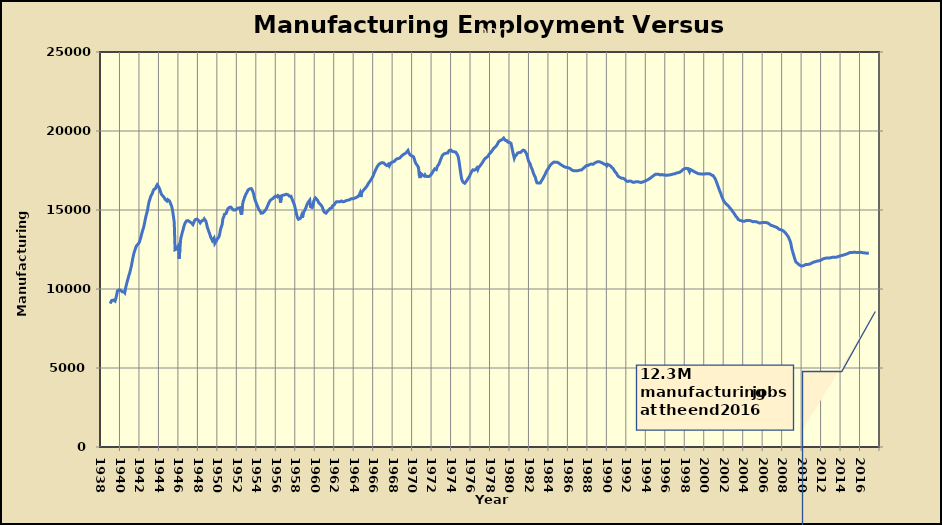
| Category | Value |
|---|---|
| 1939-01-01 | 9077 |
| 1939-02-01 | 9175 |
| 1939-03-01 | 9275 |
| 1939-04-01 | 9309 |
| 1939-05-01 | 9299 |
| 1939-06-01 | 9315 |
| 1939-07-01 | 9231 |
| 1939-08-01 | 9400 |
| 1939-09-01 | 9604 |
| 1939-10-01 | 9873 |
| 1939-11-01 | 9896 |
| 1939-12-01 | 9949 |
| 1940-01-01 | 9927 |
| 1940-02-01 | 9916 |
| 1940-03-01 | 9884 |
| 1940-04-01 | 9817 |
| 1940-05-01 | 9810 |
| 1940-06-01 | 9832 |
| 1940-07-01 | 9766 |
| 1940-08-01 | 10048 |
| 1940-09-01 | 10258 |
| 1940-10-01 | 10471 |
| 1940-11-01 | 10643 |
| 1940-12-01 | 10847 |
| 1941-01-01 | 10993 |
| 1941-02-01 | 11211 |
| 1941-03-01 | 11409 |
| 1941-04-01 | 11698 |
| 1941-05-01 | 11957 |
| 1941-06-01 | 12204 |
| 1941-07-01 | 12382 |
| 1941-08-01 | 12532 |
| 1941-09-01 | 12683 |
| 1941-10-01 | 12770 |
| 1941-11-01 | 12810 |
| 1941-12-01 | 12876 |
| 1942-01-01 | 12965 |
| 1942-02-01 | 13127 |
| 1942-03-01 | 13311 |
| 1942-04-01 | 13509 |
| 1942-05-01 | 13704 |
| 1942-06-01 | 13842 |
| 1942-07-01 | 14072 |
| 1942-08-01 | 14339 |
| 1942-09-01 | 14582 |
| 1942-10-01 | 14772 |
| 1942-11-01 | 14971 |
| 1942-12-01 | 15288 |
| 1943-01-01 | 15532 |
| 1943-02-01 | 15685 |
| 1943-03-01 | 15856 |
| 1943-04-01 | 15961 |
| 1943-05-01 | 16044 |
| 1943-06-01 | 16204 |
| 1943-07-01 | 16306 |
| 1943-08-01 | 16369 |
| 1943-09-01 | 16366 |
| 1943-10-01 | 16512 |
| 1943-11-01 | 16598 |
| 1943-12-01 | 16526 |
| 1944-01-01 | 16439 |
| 1944-02-01 | 16330 |
| 1944-03-01 | 16170 |
| 1944-04-01 | 16012 |
| 1944-05-01 | 15944 |
| 1944-06-01 | 15890 |
| 1944-07-01 | 15832 |
| 1944-08-01 | 15781 |
| 1944-09-01 | 15662 |
| 1944-10-01 | 15630 |
| 1944-11-01 | 15568 |
| 1944-12-01 | 15659 |
| 1945-01-01 | 15669 |
| 1945-02-01 | 15581 |
| 1945-03-01 | 15473 |
| 1945-04-01 | 15335 |
| 1945-05-01 | 15201 |
| 1945-06-01 | 14948 |
| 1945-07-01 | 14599 |
| 1945-08-01 | 14201 |
| 1945-09-01 | 12486 |
| 1945-10-01 | 12487 |
| 1945-11-01 | 12537 |
| 1945-12-01 | 12528 |
| 1946-01-01 | 12719 |
| 1946-02-01 | 11922 |
| 1946-03-01 | 12545 |
| 1946-04-01 | 13200 |
| 1946-05-01 | 13389 |
| 1946-06-01 | 13598 |
| 1946-07-01 | 13771 |
| 1946-08-01 | 13981 |
| 1946-09-01 | 14135 |
| 1946-10-01 | 14182 |
| 1946-11-01 | 14310 |
| 1946-12-01 | 14301 |
| 1947-01-01 | 14328 |
| 1947-02-01 | 14278 |
| 1947-03-01 | 14259 |
| 1947-04-01 | 14240 |
| 1947-05-01 | 14189 |
| 1947-06-01 | 14200 |
| 1947-07-01 | 14076 |
| 1947-08-01 | 14200 |
| 1947-09-01 | 14315 |
| 1947-10-01 | 14393 |
| 1947-11-01 | 14414 |
| 1947-12-01 | 14428 |
| 1948-01-01 | 14438 |
| 1948-02-01 | 14339 |
| 1948-03-01 | 14364 |
| 1948-04-01 | 14183 |
| 1948-05-01 | 14235 |
| 1948-06-01 | 14318 |
| 1948-07-01 | 14359 |
| 1948-08-01 | 14353 |
| 1948-09-01 | 14441 |
| 1948-10-01 | 14390 |
| 1948-11-01 | 14292 |
| 1948-12-01 | 14086 |
| 1949-01-01 | 13867 |
| 1949-02-01 | 13734 |
| 1949-03-01 | 13581 |
| 1949-04-01 | 13439 |
| 1949-05-01 | 13269 |
| 1949-06-01 | 13178 |
| 1949-07-01 | 13067 |
| 1949-08-01 | 13158 |
| 1949-09-01 | 13225 |
| 1949-10-01 | 12891 |
| 1949-11-01 | 12882 |
| 1949-12-01 | 13062 |
| 1950-01-01 | 13161 |
| 1950-02-01 | 13169 |
| 1950-03-01 | 13290 |
| 1950-04-01 | 13471 |
| 1950-05-01 | 13780 |
| 1950-06-01 | 13923 |
| 1950-07-01 | 14072 |
| 1950-08-01 | 14461 |
| 1950-09-01 | 14561 |
| 1950-10-01 | 14737 |
| 1950-11-01 | 14762 |
| 1950-12-01 | 14782 |
| 1951-01-01 | 14950 |
| 1951-02-01 | 15076 |
| 1951-03-01 | 15125 |
| 1951-04-01 | 15166 |
| 1951-05-01 | 15164 |
| 1951-06-01 | 15176 |
| 1951-07-01 | 15110 |
| 1951-08-01 | 15061 |
| 1951-09-01 | 14996 |
| 1951-10-01 | 14973 |
| 1951-11-01 | 14999 |
| 1951-12-01 | 15045 |
| 1952-01-01 | 15067 |
| 1952-02-01 | 15105 |
| 1952-03-01 | 15127 |
| 1952-04-01 | 15162 |
| 1952-05-01 | 15143 |
| 1952-06-01 | 14828 |
| 1952-07-01 | 14707 |
| 1952-08-01 | 15279 |
| 1952-09-01 | 15553 |
| 1952-10-01 | 15690 |
| 1952-11-01 | 15843 |
| 1952-12-01 | 15973 |
| 1953-01-01 | 16067 |
| 1953-02-01 | 16158 |
| 1953-03-01 | 16270 |
| 1953-04-01 | 16293 |
| 1953-05-01 | 16341 |
| 1953-06-01 | 16343 |
| 1953-07-01 | 16353 |
| 1953-08-01 | 16278 |
| 1953-09-01 | 16151 |
| 1953-10-01 | 15981 |
| 1953-11-01 | 15728 |
| 1953-12-01 | 15581 |
| 1954-01-01 | 15440 |
| 1954-02-01 | 15307 |
| 1954-03-01 | 15197 |
| 1954-04-01 | 15065 |
| 1954-05-01 | 14974 |
| 1954-06-01 | 14910 |
| 1954-07-01 | 14799 |
| 1954-08-01 | 14772 |
| 1954-09-01 | 14805 |
| 1954-10-01 | 14841 |
| 1954-11-01 | 14913 |
| 1954-12-01 | 14967 |
| 1955-01-01 | 15034 |
| 1955-02-01 | 15138 |
| 1955-03-01 | 15258 |
| 1955-04-01 | 15375 |
| 1955-05-01 | 15493 |
| 1955-06-01 | 15585 |
| 1955-07-01 | 15614 |
| 1955-08-01 | 15679 |
| 1955-09-01 | 15668 |
| 1955-10-01 | 15740 |
| 1955-11-01 | 15813 |
| 1955-12-01 | 15859 |
| 1956-01-01 | 15882 |
| 1956-02-01 | 15889 |
| 1956-03-01 | 15829 |
| 1956-04-01 | 15909 |
| 1956-05-01 | 15893 |
| 1956-06-01 | 15835 |
| 1956-07-01 | 15468 |
| 1956-08-01 | 15893 |
| 1956-09-01 | 15863 |
| 1956-10-01 | 15937 |
| 1956-11-01 | 15916 |
| 1956-12-01 | 15957 |
| 1957-01-01 | 15970 |
| 1957-02-01 | 15998 |
| 1957-03-01 | 15994 |
| 1957-04-01 | 15970 |
| 1957-05-01 | 15931 |
| 1957-06-01 | 15873 |
| 1957-07-01 | 15854 |
| 1957-08-01 | 15867 |
| 1957-09-01 | 15710 |
| 1957-10-01 | 15599 |
| 1957-11-01 | 15466 |
| 1957-12-01 | 15332 |
| 1958-01-01 | 15130 |
| 1958-02-01 | 14908 |
| 1958-03-01 | 14670 |
| 1958-04-01 | 14506 |
| 1958-05-01 | 14414 |
| 1958-06-01 | 14408 |
| 1958-07-01 | 14450 |
| 1958-08-01 | 14524 |
| 1958-09-01 | 14658 |
| 1958-10-01 | 14503 |
| 1958-11-01 | 14827 |
| 1958-12-01 | 14877 |
| 1959-01-01 | 14998 |
| 1959-02-01 | 15115 |
| 1959-03-01 | 15259 |
| 1959-04-01 | 15385 |
| 1959-05-01 | 15487 |
| 1959-06-01 | 15554 |
| 1959-07-01 | 15623 |
| 1959-08-01 | 15202 |
| 1959-09-01 | 15254 |
| 1959-10-01 | 15158 |
| 1959-11-01 | 15300 |
| 1959-12-01 | 15573 |
| 1960-01-01 | 15687 |
| 1960-02-01 | 15765 |
| 1960-03-01 | 15707 |
| 1960-04-01 | 15654 |
| 1960-05-01 | 15575 |
| 1960-06-01 | 15466 |
| 1960-07-01 | 15413 |
| 1960-08-01 | 15360 |
| 1960-09-01 | 15330 |
| 1960-10-01 | 15231 |
| 1960-11-01 | 15112 |
| 1960-12-01 | 14947 |
| 1961-01-01 | 14863 |
| 1961-02-01 | 14801 |
| 1961-03-01 | 14802 |
| 1961-04-01 | 14825 |
| 1961-05-01 | 14932 |
| 1961-06-01 | 14981 |
| 1961-07-01 | 15029 |
| 1961-08-01 | 15093 |
| 1961-09-01 | 15080 |
| 1961-10-01 | 15143 |
| 1961-11-01 | 15259 |
| 1961-12-01 | 15309 |
| 1962-01-01 | 15322 |
| 1962-02-01 | 15411 |
| 1962-03-01 | 15451 |
| 1962-04-01 | 15524 |
| 1962-05-01 | 15513 |
| 1962-06-01 | 15518 |
| 1962-07-01 | 15522 |
| 1962-08-01 | 15517 |
| 1962-09-01 | 15568 |
| 1962-10-01 | 15569 |
| 1962-11-01 | 15530 |
| 1962-12-01 | 15520 |
| 1963-01-01 | 15545 |
| 1963-02-01 | 15542 |
| 1963-03-01 | 15564 |
| 1963-04-01 | 15602 |
| 1963-05-01 | 15641 |
| 1963-06-01 | 15624 |
| 1963-07-01 | 15646 |
| 1963-08-01 | 15644 |
| 1963-09-01 | 15674 |
| 1963-10-01 | 15714 |
| 1963-11-01 | 15675 |
| 1963-12-01 | 15712 |
| 1964-01-01 | 15715 |
| 1964-02-01 | 15742 |
| 1964-03-01 | 15770 |
| 1964-04-01 | 15785 |
| 1964-05-01 | 15812 |
| 1964-06-01 | 15839 |
| 1964-07-01 | 15887 |
| 1964-08-01 | 15948 |
| 1964-09-01 | 16073 |
| 1964-10-01 | 15821 |
| 1964-11-01 | 16096 |
| 1964-12-01 | 16176 |
| 1965-01-01 | 16245 |
| 1965-02-01 | 16291 |
| 1965-03-01 | 16353 |
| 1965-04-01 | 16418 |
| 1965-05-01 | 16477 |
| 1965-06-01 | 16554 |
| 1965-07-01 | 16669 |
| 1965-08-01 | 16732 |
| 1965-09-01 | 16802 |
| 1965-10-01 | 16864 |
| 1965-11-01 | 16962 |
| 1965-12-01 | 17051 |
| 1966-01-01 | 17143 |
| 1966-02-01 | 17288 |
| 1966-03-01 | 17400 |
| 1966-04-01 | 17517 |
| 1966-05-01 | 17625 |
| 1966-06-01 | 17733 |
| 1966-07-01 | 17760 |
| 1966-08-01 | 17882 |
| 1966-09-01 | 17886 |
| 1966-10-01 | 17956 |
| 1966-11-01 | 17981 |
| 1966-12-01 | 17998 |
| 1967-01-01 | 18033 |
| 1967-02-01 | 17978 |
| 1967-03-01 | 17940 |
| 1967-04-01 | 17878 |
| 1967-05-01 | 17832 |
| 1967-06-01 | 17812 |
| 1967-07-01 | 17784 |
| 1967-08-01 | 17905 |
| 1967-09-01 | 17794 |
| 1967-10-01 | 17800 |
| 1967-11-01 | 17985 |
| 1967-12-01 | 18025 |
| 1968-01-01 | 18040 |
| 1968-02-01 | 18054 |
| 1968-03-01 | 18067 |
| 1968-04-01 | 18131 |
| 1968-05-01 | 18190 |
| 1968-06-01 | 18228 |
| 1968-07-01 | 18265 |
| 1968-08-01 | 18254 |
| 1968-09-01 | 18252 |
| 1968-10-01 | 18293 |
| 1968-11-01 | 18346 |
| 1968-12-01 | 18410 |
| 1969-01-01 | 18432 |
| 1969-02-01 | 18502 |
| 1969-03-01 | 18558 |
| 1969-04-01 | 18554 |
| 1969-05-01 | 18588 |
| 1969-06-01 | 18640 |
| 1969-07-01 | 18642 |
| 1969-08-01 | 18767 |
| 1969-09-01 | 18620 |
| 1969-10-01 | 18613 |
| 1969-11-01 | 18467 |
| 1969-12-01 | 18485 |
| 1970-01-01 | 18424 |
| 1970-02-01 | 18361 |
| 1970-03-01 | 18360 |
| 1970-04-01 | 18207 |
| 1970-05-01 | 18029 |
| 1970-06-01 | 17930 |
| 1970-07-01 | 17877 |
| 1970-08-01 | 17779 |
| 1970-09-01 | 17692 |
| 1970-10-01 | 17173 |
| 1970-11-01 | 17024 |
| 1970-12-01 | 17309 |
| 1971-01-01 | 17280 |
| 1971-02-01 | 17216 |
| 1971-03-01 | 17154 |
| 1971-04-01 | 17149 |
| 1971-05-01 | 17225 |
| 1971-06-01 | 17139 |
| 1971-07-01 | 17126 |
| 1971-08-01 | 17115 |
| 1971-09-01 | 17154 |
| 1971-10-01 | 17126 |
| 1971-11-01 | 17166 |
| 1971-12-01 | 17202 |
| 1972-01-01 | 17283 |
| 1972-02-01 | 17361 |
| 1972-03-01 | 17447 |
| 1972-04-01 | 17508 |
| 1972-05-01 | 17602 |
| 1972-06-01 | 17641 |
| 1972-07-01 | 17556 |
| 1972-08-01 | 17741 |
| 1972-09-01 | 17774 |
| 1972-10-01 | 17893 |
| 1972-11-01 | 18005 |
| 1972-12-01 | 18158 |
| 1973-01-01 | 18276 |
| 1973-02-01 | 18410 |
| 1973-03-01 | 18493 |
| 1973-04-01 | 18530 |
| 1973-05-01 | 18564 |
| 1973-06-01 | 18606 |
| 1973-07-01 | 18598 |
| 1973-08-01 | 18629 |
| 1973-09-01 | 18609 |
| 1973-10-01 | 18702 |
| 1973-11-01 | 18773 |
| 1973-12-01 | 18820 |
| 1974-01-01 | 18788 |
| 1974-02-01 | 18727 |
| 1974-03-01 | 18700 |
| 1974-04-01 | 18702 |
| 1974-05-01 | 18688 |
| 1974-06-01 | 18690 |
| 1974-07-01 | 18656 |
| 1974-08-01 | 18570 |
| 1974-09-01 | 18492 |
| 1974-10-01 | 18364 |
| 1974-11-01 | 18077 |
| 1974-12-01 | 17693 |
| 1975-01-01 | 17344 |
| 1975-02-01 | 17004 |
| 1975-03-01 | 16853 |
| 1975-04-01 | 16759 |
| 1975-05-01 | 16746 |
| 1975-06-01 | 16690 |
| 1975-07-01 | 16678 |
| 1975-08-01 | 16824 |
| 1975-09-01 | 16904 |
| 1975-10-01 | 16984 |
| 1975-11-01 | 17025 |
| 1975-12-01 | 17140 |
| 1976-01-01 | 17287 |
| 1976-02-01 | 17384 |
| 1976-03-01 | 17470 |
| 1976-04-01 | 17541 |
| 1976-05-01 | 17513 |
| 1976-06-01 | 17521 |
| 1976-07-01 | 17524 |
| 1976-08-01 | 17596 |
| 1976-09-01 | 17665 |
| 1976-10-01 | 17548 |
| 1976-11-01 | 17682 |
| 1976-12-01 | 17719 |
| 1977-01-01 | 17803 |
| 1977-02-01 | 17843 |
| 1977-03-01 | 17941 |
| 1977-04-01 | 18024 |
| 1977-05-01 | 18107 |
| 1977-06-01 | 18192 |
| 1977-07-01 | 18259 |
| 1977-08-01 | 18276 |
| 1977-09-01 | 18334 |
| 1977-10-01 | 18356 |
| 1977-11-01 | 18419 |
| 1977-12-01 | 18531 |
| 1978-01-01 | 18593 |
| 1978-02-01 | 18639 |
| 1978-03-01 | 18699 |
| 1978-04-01 | 18772 |
| 1978-05-01 | 18848 |
| 1978-06-01 | 18919 |
| 1978-07-01 | 18951 |
| 1978-08-01 | 19006 |
| 1978-09-01 | 19068 |
| 1978-10-01 | 19142 |
| 1978-11-01 | 19257 |
| 1978-12-01 | 19334 |
| 1979-01-01 | 19388 |
| 1979-02-01 | 19409 |
| 1979-03-01 | 19453 |
| 1979-04-01 | 19450 |
| 1979-05-01 | 19509 |
| 1979-06-01 | 19553 |
| 1979-07-01 | 19531 |
| 1979-08-01 | 19406 |
| 1979-09-01 | 19442 |
| 1979-10-01 | 19390 |
| 1979-11-01 | 19299 |
| 1979-12-01 | 19301 |
| 1980-01-01 | 19282 |
| 1980-02-01 | 19219 |
| 1980-03-01 | 19217 |
| 1980-04-01 | 18973 |
| 1980-05-01 | 18726 |
| 1980-06-01 | 18490 |
| 1980-07-01 | 18276 |
| 1980-08-01 | 18414 |
| 1980-09-01 | 18445 |
| 1980-10-01 | 18506 |
| 1980-11-01 | 18601 |
| 1980-12-01 | 18640 |
| 1981-01-01 | 18639 |
| 1981-02-01 | 18613 |
| 1981-03-01 | 18647 |
| 1981-04-01 | 18711 |
| 1981-05-01 | 18766 |
| 1981-06-01 | 18789 |
| 1981-07-01 | 18785 |
| 1981-08-01 | 18748 |
| 1981-09-01 | 18712 |
| 1981-10-01 | 18566 |
| 1981-11-01 | 18409 |
| 1981-12-01 | 18223 |
| 1982-01-01 | 18047 |
| 1982-02-01 | 17981 |
| 1982-03-01 | 17857 |
| 1982-04-01 | 17683 |
| 1982-05-01 | 17588 |
| 1982-06-01 | 17430 |
| 1982-07-01 | 17278 |
| 1982-08-01 | 17160 |
| 1982-09-01 | 17074 |
| 1982-10-01 | 16853 |
| 1982-11-01 | 16722 |
| 1982-12-01 | 16690 |
| 1983-01-01 | 16705 |
| 1983-02-01 | 16706 |
| 1983-03-01 | 16711 |
| 1983-04-01 | 16794 |
| 1983-05-01 | 16885 |
| 1983-06-01 | 16960 |
| 1983-07-01 | 17059 |
| 1983-08-01 | 17118 |
| 1983-09-01 | 17255 |
| 1983-10-01 | 17367 |
| 1983-11-01 | 17479 |
| 1983-12-01 | 17551 |
| 1984-01-01 | 17630 |
| 1984-02-01 | 17728 |
| 1984-03-01 | 17806 |
| 1984-04-01 | 17872 |
| 1984-05-01 | 17916 |
| 1984-06-01 | 17967 |
| 1984-07-01 | 18013 |
| 1984-08-01 | 18034 |
| 1984-09-01 | 18019 |
| 1984-10-01 | 18024 |
| 1984-11-01 | 18016 |
| 1984-12-01 | 18023 |
| 1985-01-01 | 18009 |
| 1985-02-01 | 17966 |
| 1985-03-01 | 17939 |
| 1985-04-01 | 17886 |
| 1985-05-01 | 17855 |
| 1985-06-01 | 17819 |
| 1985-07-01 | 17776 |
| 1985-08-01 | 17756 |
| 1985-09-01 | 17718 |
| 1985-10-01 | 17708 |
| 1985-11-01 | 17697 |
| 1985-12-01 | 17693 |
| 1986-01-01 | 17686 |
| 1986-02-01 | 17663 |
| 1986-03-01 | 17624 |
| 1986-04-01 | 17616 |
| 1986-05-01 | 17593 |
| 1986-06-01 | 17530 |
| 1986-07-01 | 17497 |
| 1986-08-01 | 17489 |
| 1986-09-01 | 17498 |
| 1986-10-01 | 17477 |
| 1986-11-01 | 17472 |
| 1986-12-01 | 17478 |
| 1987-01-01 | 17465 |
| 1987-02-01 | 17499 |
| 1987-03-01 | 17507 |
| 1987-04-01 | 17525 |
| 1987-05-01 | 17542 |
| 1987-06-01 | 17537 |
| 1987-07-01 | 17593 |
| 1987-08-01 | 17630 |
| 1987-09-01 | 17691 |
| 1987-10-01 | 17729 |
| 1987-11-01 | 17775 |
| 1987-12-01 | 17809 |
| 1988-01-01 | 17790 |
| 1988-02-01 | 17823 |
| 1988-03-01 | 17844 |
| 1988-04-01 | 17874 |
| 1988-05-01 | 17892 |
| 1988-06-01 | 17916 |
| 1988-07-01 | 17926 |
| 1988-08-01 | 17891 |
| 1988-09-01 | 17914 |
| 1988-10-01 | 17966 |
| 1988-11-01 | 18003 |
| 1988-12-01 | 18025 |
| 1989-01-01 | 18057 |
| 1989-02-01 | 18055 |
| 1989-03-01 | 18060 |
| 1989-04-01 | 18055 |
| 1989-05-01 | 18040 |
| 1989-06-01 | 18013 |
| 1989-07-01 | 17980 |
| 1989-08-01 | 17964 |
| 1989-09-01 | 17922 |
| 1989-10-01 | 17895 |
| 1989-11-01 | 17886 |
| 1989-12-01 | 17881 |
| 1990-01-01 | 17797 |
| 1990-02-01 | 17893 |
| 1990-03-01 | 17868 |
| 1990-04-01 | 17845 |
| 1990-05-01 | 17797 |
| 1990-06-01 | 17776 |
| 1990-07-01 | 17704 |
| 1990-08-01 | 17649 |
| 1990-09-01 | 17609 |
| 1990-10-01 | 17577 |
| 1990-11-01 | 17428 |
| 1990-12-01 | 17395 |
| 1991-01-01 | 17330 |
| 1991-02-01 | 17211 |
| 1991-03-01 | 17140 |
| 1991-04-01 | 17093 |
| 1991-05-01 | 17070 |
| 1991-06-01 | 17044 |
| 1991-07-01 | 17015 |
| 1991-08-01 | 17025 |
| 1991-09-01 | 17010 |
| 1991-10-01 | 16999 |
| 1991-11-01 | 16961 |
| 1991-12-01 | 16916 |
| 1992-01-01 | 16839 |
| 1992-02-01 | 16829 |
| 1992-03-01 | 16805 |
| 1992-04-01 | 16831 |
| 1992-05-01 | 16835 |
| 1992-06-01 | 16826 |
| 1992-07-01 | 16819 |
| 1992-08-01 | 16783 |
| 1992-09-01 | 16761 |
| 1992-10-01 | 16751 |
| 1992-11-01 | 16758 |
| 1992-12-01 | 16769 |
| 1993-01-01 | 16791 |
| 1993-02-01 | 16805 |
| 1993-03-01 | 16795 |
| 1993-04-01 | 16772 |
| 1993-05-01 | 16766 |
| 1993-06-01 | 16742 |
| 1993-07-01 | 16739 |
| 1993-08-01 | 16741 |
| 1993-09-01 | 16769 |
| 1993-10-01 | 16778 |
| 1993-11-01 | 16800 |
| 1993-12-01 | 16815 |
| 1994-01-01 | 16855 |
| 1994-02-01 | 16862 |
| 1994-03-01 | 16897 |
| 1994-04-01 | 16933 |
| 1994-05-01 | 16962 |
| 1994-06-01 | 17010 |
| 1994-07-01 | 17026 |
| 1994-08-01 | 17081 |
| 1994-09-01 | 17115 |
| 1994-10-01 | 17144 |
| 1994-11-01 | 17186 |
| 1994-12-01 | 17217 |
| 1995-01-01 | 17262 |
| 1995-02-01 | 17265 |
| 1995-03-01 | 17263 |
| 1995-04-01 | 17278 |
| 1995-05-01 | 17259 |
| 1995-06-01 | 17247 |
| 1995-07-01 | 17218 |
| 1995-08-01 | 17240 |
| 1995-09-01 | 17247 |
| 1995-10-01 | 17216 |
| 1995-11-01 | 17209 |
| 1995-12-01 | 17231 |
| 1996-01-01 | 17208 |
| 1996-02-01 | 17229 |
| 1996-03-01 | 17193 |
| 1996-04-01 | 17204 |
| 1996-05-01 | 17222 |
| 1996-06-01 | 17226 |
| 1996-07-01 | 17223 |
| 1996-08-01 | 17255 |
| 1996-09-01 | 17252 |
| 1996-10-01 | 17268 |
| 1996-11-01 | 17277 |
| 1996-12-01 | 17284 |
| 1997-01-01 | 17297 |
| 1997-02-01 | 17316 |
| 1997-03-01 | 17340 |
| 1997-04-01 | 17349 |
| 1997-05-01 | 17362 |
| 1997-06-01 | 17387 |
| 1997-07-01 | 17389 |
| 1997-08-01 | 17452 |
| 1997-09-01 | 17465 |
| 1997-10-01 | 17513 |
| 1997-11-01 | 17556 |
| 1997-12-01 | 17588 |
| 1998-01-01 | 17619 |
| 1998-02-01 | 17627 |
| 1998-03-01 | 17637 |
| 1998-04-01 | 17637 |
| 1998-05-01 | 17624 |
| 1998-06-01 | 17608 |
| 1998-07-01 | 17422 |
| 1998-08-01 | 17563 |
| 1998-09-01 | 17557 |
| 1998-10-01 | 17512 |
| 1998-11-01 | 17465 |
| 1998-12-01 | 17449 |
| 1999-01-01 | 17427 |
| 1999-02-01 | 17395 |
| 1999-03-01 | 17368 |
| 1999-04-01 | 17344 |
| 1999-05-01 | 17333 |
| 1999-06-01 | 17295 |
| 1999-07-01 | 17308 |
| 1999-08-01 | 17287 |
| 1999-09-01 | 17281 |
| 1999-10-01 | 17272 |
| 1999-11-01 | 17282 |
| 1999-12-01 | 17280 |
| 2000-01-01 | 17284 |
| 2000-02-01 | 17285 |
| 2000-03-01 | 17302 |
| 2000-04-01 | 17298 |
| 2000-05-01 | 17279 |
| 2000-06-01 | 17296 |
| 2000-07-01 | 17322 |
| 2000-08-01 | 17287 |
| 2000-09-01 | 17230 |
| 2000-10-01 | 17217 |
| 2000-11-01 | 17202 |
| 2000-12-01 | 17181 |
| 2001-01-01 | 17104 |
| 2001-02-01 | 17028 |
| 2001-03-01 | 16938 |
| 2001-04-01 | 16802 |
| 2001-05-01 | 16661 |
| 2001-06-01 | 16515 |
| 2001-07-01 | 16382 |
| 2001-08-01 | 16232 |
| 2001-09-01 | 16117 |
| 2001-10-01 | 15972 |
| 2001-11-01 | 15825 |
| 2001-12-01 | 15711 |
| 2002-01-01 | 15587 |
| 2002-02-01 | 15515 |
| 2002-03-01 | 15443 |
| 2002-04-01 | 15392 |
| 2002-05-01 | 15337 |
| 2002-06-01 | 15298 |
| 2002-07-01 | 15256 |
| 2002-08-01 | 15171 |
| 2002-09-01 | 15119 |
| 2002-10-01 | 15060 |
| 2002-11-01 | 14992 |
| 2002-12-01 | 14912 |
| 2003-01-01 | 14866 |
| 2003-02-01 | 14781 |
| 2003-03-01 | 14721 |
| 2003-04-01 | 14609 |
| 2003-05-01 | 14557 |
| 2003-06-01 | 14493 |
| 2003-07-01 | 14402 |
| 2003-08-01 | 14376 |
| 2003-09-01 | 14347 |
| 2003-10-01 | 14334 |
| 2003-11-01 | 14316 |
| 2003-12-01 | 14300 |
| 2004-01-01 | 14290 |
| 2004-02-01 | 14279 |
| 2004-03-01 | 14287 |
| 2004-04-01 | 14315 |
| 2004-05-01 | 14342 |
| 2004-06-01 | 14332 |
| 2004-07-01 | 14330 |
| 2004-08-01 | 14345 |
| 2004-09-01 | 14331 |
| 2004-10-01 | 14332 |
| 2004-11-01 | 14307 |
| 2004-12-01 | 14287 |
| 2005-01-01 | 14257 |
| 2005-02-01 | 14273 |
| 2005-03-01 | 14269 |
| 2005-04-01 | 14250 |
| 2005-05-01 | 14256 |
| 2005-06-01 | 14227 |
| 2005-07-01 | 14226 |
| 2005-08-01 | 14203 |
| 2005-09-01 | 14175 |
| 2005-10-01 | 14192 |
| 2005-11-01 | 14187 |
| 2005-12-01 | 14193 |
| 2006-01-01 | 14210 |
| 2006-02-01 | 14209 |
| 2006-03-01 | 14214 |
| 2006-04-01 | 14226 |
| 2006-05-01 | 14203 |
| 2006-06-01 | 14213 |
| 2006-07-01 | 14188 |
| 2006-08-01 | 14159 |
| 2006-09-01 | 14125 |
| 2006-10-01 | 14075 |
| 2006-11-01 | 14041 |
| 2006-12-01 | 14015 |
| 2007-01-01 | 14008 |
| 2007-02-01 | 13997 |
| 2007-03-01 | 13970 |
| 2007-04-01 | 13945 |
| 2007-05-01 | 13929 |
| 2007-06-01 | 13911 |
| 2007-07-01 | 13889 |
| 2007-08-01 | 13828 |
| 2007-09-01 | 13790 |
| 2007-10-01 | 13764 |
| 2007-11-01 | 13757 |
| 2007-12-01 | 13746 |
| 2008-01-01 | 13725 |
| 2008-02-01 | 13696 |
| 2008-03-01 | 13659 |
| 2008-04-01 | 13599 |
| 2008-05-01 | 13564 |
| 2008-06-01 | 13504 |
| 2008-07-01 | 13430 |
| 2008-08-01 | 13358 |
| 2008-09-01 | 13275 |
| 2008-10-01 | 13147 |
| 2008-11-01 | 13034 |
| 2008-12-01 | 12850 |
| 2009-01-01 | 12561 |
| 2009-02-01 | 12380 |
| 2009-03-01 | 12208 |
| 2009-04-01 | 12030 |
| 2009-05-01 | 11862 |
| 2009-06-01 | 11726 |
| 2009-07-01 | 11668 |
| 2009-08-01 | 11626 |
| 2009-09-01 | 11591 |
| 2009-10-01 | 11538 |
| 2009-11-01 | 11509 |
| 2009-12-01 | 11475 |
| 2010-01-01 | 11460 |
| 2010-02-01 | 11453 |
| 2010-03-01 | 11453 |
| 2010-04-01 | 11489 |
| 2010-05-01 | 11525 |
| 2010-06-01 | 11545 |
| 2010-07-01 | 11561 |
| 2010-08-01 | 11553 |
| 2010-09-01 | 11563 |
| 2010-10-01 | 11562 |
| 2010-11-01 | 11585 |
| 2010-12-01 | 11595 |
| 2011-01-01 | 11621 |
| 2011-02-01 | 11654 |
| 2011-03-01 | 11675 |
| 2011-04-01 | 11704 |
| 2011-05-01 | 11713 |
| 2011-06-01 | 11727 |
| 2011-07-01 | 11746 |
| 2011-08-01 | 11764 |
| 2011-09-01 | 11769 |
| 2011-10-01 | 11780 |
| 2011-11-01 | 11770 |
| 2011-12-01 | 11802 |
| 2012-01-01 | 11836 |
| 2012-02-01 | 11859 |
| 2012-03-01 | 11899 |
| 2012-04-01 | 11915 |
| 2012-05-01 | 11929 |
| 2012-06-01 | 11942 |
| 2012-07-01 | 11967 |
| 2012-08-01 | 11961 |
| 2012-09-01 | 11952 |
| 2012-10-01 | 11959 |
| 2012-11-01 | 11948 |
| 2012-12-01 | 11960 |
| 2013-01-01 | 11980 |
| 2013-02-01 | 12001 |
| 2013-03-01 | 12003 |
| 2013-04-01 | 12004 |
| 2013-05-01 | 12002 |
| 2013-06-01 | 12002 |
| 2013-07-01 | 11983 |
| 2013-08-01 | 12014 |
| 2013-09-01 | 12029 |
| 2013-10-01 | 12050 |
| 2013-11-01 | 12076 |
| 2013-12-01 | 12086 |
| 2014-01-01 | 12094 |
| 2014-02-01 | 12115 |
| 2014-03-01 | 12125 |
| 2014-04-01 | 12139 |
| 2014-05-01 | 12146 |
| 2014-06-01 | 12171 |
| 2014-07-01 | 12189 |
| 2014-08-01 | 12205 |
| 2014-09-01 | 12217 |
| 2014-10-01 | 12243 |
| 2014-11-01 | 12272 |
| 2014-12-01 | 12294 |
| 2015-01-01 | 12311 |
| 2015-02-01 | 12315 |
| 2015-03-01 | 12318 |
| 2015-04-01 | 12316 |
| 2015-05-01 | 12324 |
| 2015-06-01 | 12325 |
| 2015-07-01 | 12336 |
| 2015-08-01 | 12318 |
| 2015-09-01 | 12309 |
| 2015-10-01 | 12311 |
| 2015-11-01 | 12314 |
| 2015-12-01 | 12320 |
| 2016-01-01 | 12338 |
| 2016-02-01 | 12322 |
| 2016-03-01 | 12293 |
| 2016-04-01 | 12298 |
| 2016-05-01 | 12281 |
| 2016-06-01 | 12289 |
| 2016-07-01 | 12291 |
| 2016-08-01 | 12275 |
| 2016-09-01 | 12269 |
| 2016-10-01 | 12265 |
| 2016-11-01 | 12258 |
| 2016-12-01 | 12275 |